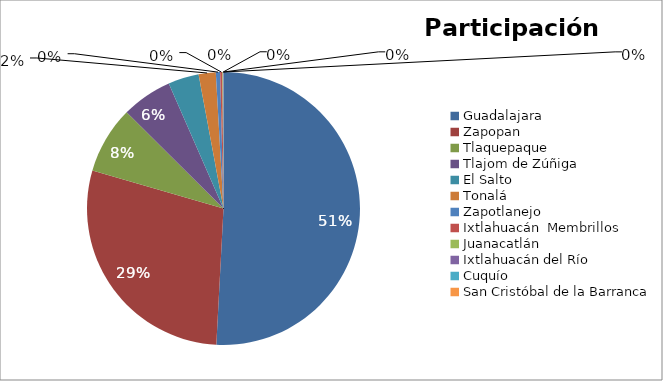
| Category | Series 0 |
|---|---|
| Guadalajara | 706582 |
| Zapopan | 398212 |
| Tlaquepaque | 110534 |
| Tlajom de Zúñiga | 83319 |
| El Salto | 50527 |
| Tonalá | 28173 |
| Zapotlanejo | 7121 |
| Ixtlahuacán  Membrillos | 3618 |
| Juanacatlán | 998 |
| Ixtlahuacán del Río | 578 |
| Cuquío | 175 |
| San Cristóbal de la Barranca | 27 |